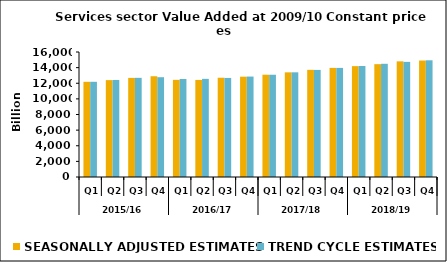
| Category | SEASONALLY ADJUSTED ESTIMATES | TREND CYCLE ESTIMATES |
|---|---|---|
| 0 | 12184.134 | 12185.451 |
| 1 | 12401.384 | 12422.427 |
| 2 | 12683.569 | 12692.889 |
| 3 | 12895.458 | 12771.614 |
| 4 | 12433.117 | 12542.974 |
| 5 | 12424.026 | 12562.153 |
| 6 | 12705.706 | 12680.507 |
| 7 | 12838.102 | 12855.475 |
| 8 | 13091.403 | 13087.719 |
| 9 | 13396.215 | 13398.377 |
| 10 | 13716.755 | 13708.009 |
| 11 | 13965.17 | 13965.794 |
| 12 | 14190.906 | 14206.557 |
| 13 | 14443.066 | 14489.127 |
| 14 | 14804.131 | 14734.629 |
| 15 | 14907.824 | 14937.423 |